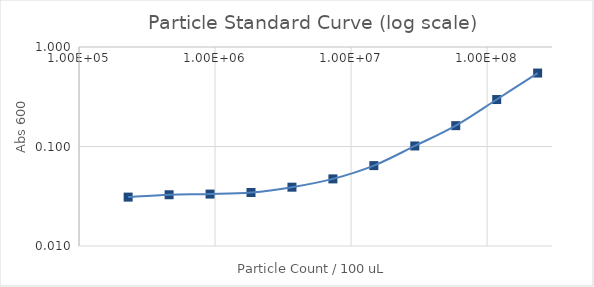
| Category | Series 1 |
|---|---|
| 235294117.64705887 | 0.547 |
| 117647058.82352944 | 0.296 |
| 58823529.41176472 | 0.162 |
| 29411764.70588236 | 0.101 |
| 14705882.35294118 | 0.064 |
| 7352941.17647059 | 0.047 |
| 3676470.588235295 | 0.039 |
| 1838235.2941176475 | 0.034 |
| 919117.6470588237 | 0.033 |
| 459558.82352941186 | 0.033 |
| 229779.41176470593 | 0.031 |